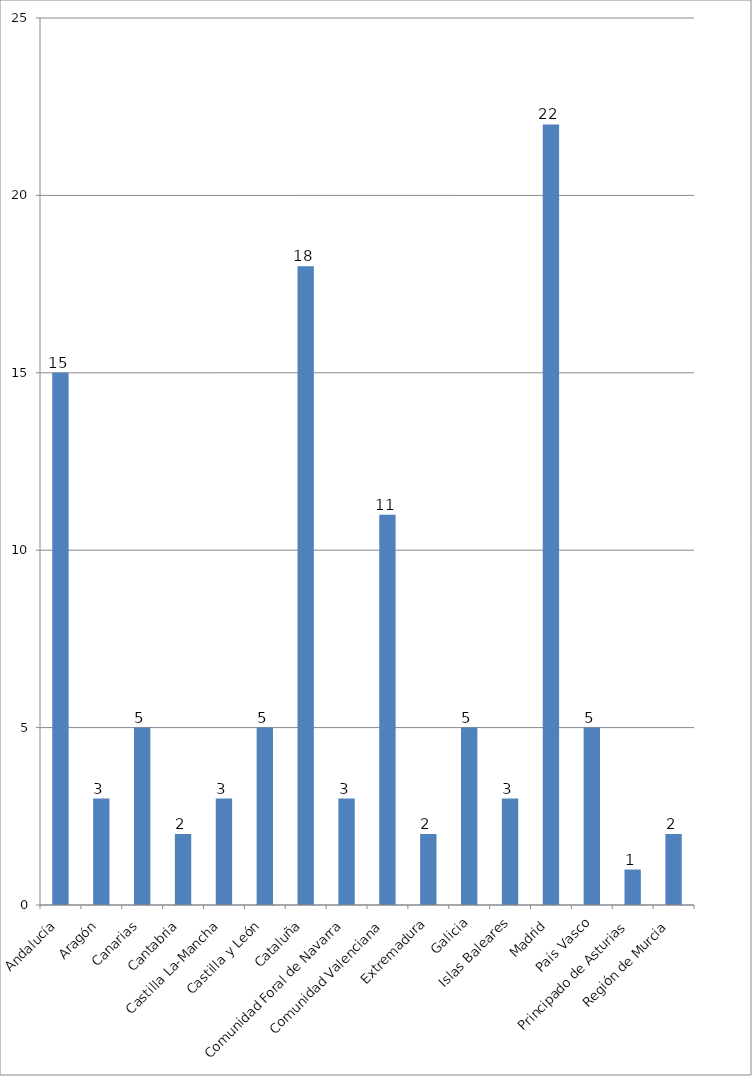
| Category | Total |
|---|---|
| Andalucía | 15 |
| Aragón | 3 |
| Canarias | 5 |
| Cantabria | 2 |
| Castilla La-Mancha | 3 |
| Castilla y León | 5 |
| Cataluña | 18 |
| Comunidad Foral de Navarra | 3 |
| Comunidad Valenciana | 11 |
| Extremadura | 2 |
| Galicia | 5 |
| Islas Baleares | 3 |
| Madrid | 22 |
| País Vasco | 5 |
| Principado de Asturias | 1 |
| Región de Murcia | 2 |